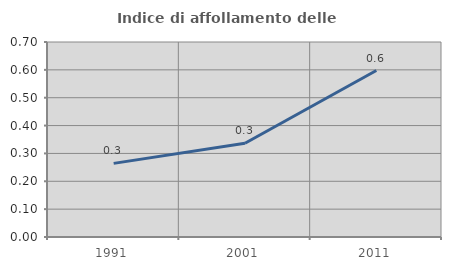
| Category | Indice di affollamento delle abitazioni  |
|---|---|
| 1991.0 | 0.264 |
| 2001.0 | 0.337 |
| 2011.0 | 0.597 |